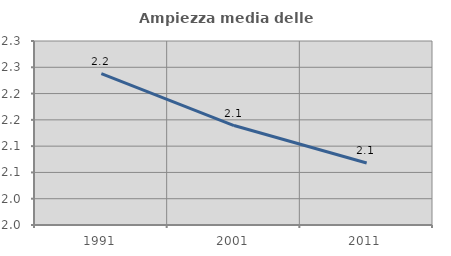
| Category | Ampiezza media delle famiglie |
|---|---|
| 1991.0 | 2.238 |
| 2001.0 | 2.139 |
| 2011.0 | 2.068 |